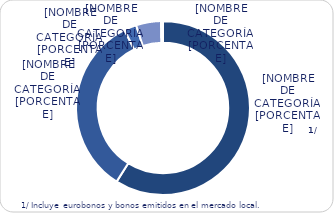
| Category | Series 0 |
|---|---|
| Inversionistas | 8975.2 |
| Multilateral | 5140.2 |
| Bilateral | 349.7 |
| BCR | 704.3 |
| Otros | 56.3 |